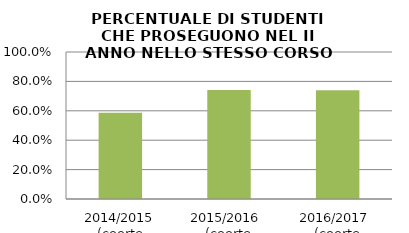
| Category | 2014/2015 (coorte 2013/14) 2015/2016  (coorte 2014/15) 2016/2017  (coorte 2015/16) |
|---|---|
| 2014/2015 (coorte 2013/14) | 0.587 |
| 2015/2016  (coorte 2014/15) | 0.741 |
| 2016/2017  (coorte 2015/16) | 0.74 |